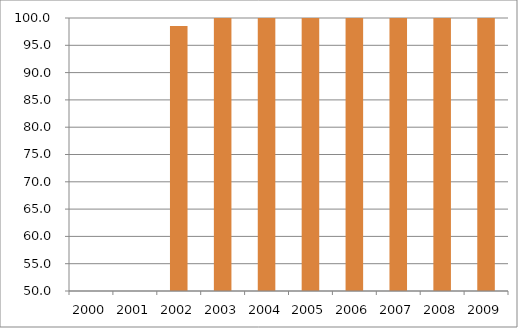
| Category | Região Centro-Oeste |
|---|---|
| 2000.0 | 0 |
| 2001.0 | 0 |
| 2002.0 | 98.52 |
| 2003.0 | 112.41 |
| 2004.0 | 105.01 |
| 2005.0 | 105.38 |
| 2006.0 | 102.1 |
| 2007.0 | 107.16 |
| 2008.0 | 102.84 |
| 2009.0 | 102.25 |